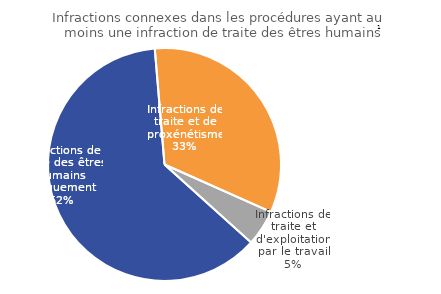
| Category | Series 0 |
|---|---|
| Infractions de traite des êtres humains uniquement | 62 |
| Infractions de traite et de proxénétisme | 33 |
| Infractions de traite et d'exploitation par le travail | 5 |